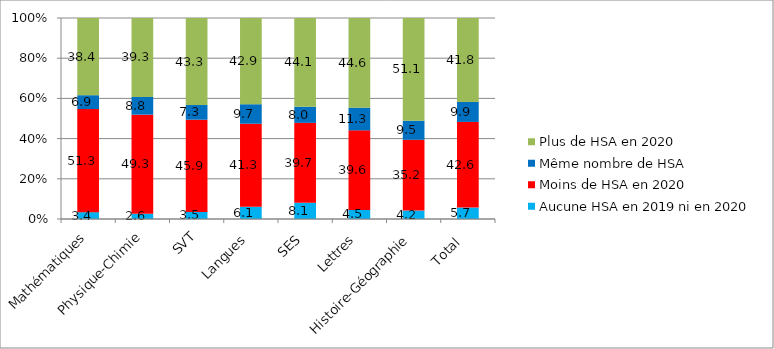
| Category | Aucune HSA en 2019 ni en 2020 | Moins de HSA en 2020 | Même nombre de HSA | Plus de HSA en 2020 |
|---|---|---|---|---|
| Mathématiques | 3.4 | 51.3 | 6.9 | 38.4 |
| Physique-Chimie | 2.6 | 49.3 | 8.8 | 39.3 |
| SVT | 3.5 | 45.9 | 7.3 | 43.3 |
| Langues | 6.1 | 41.3 | 9.7 | 42.9 |
| SES | 8.1 | 39.7 | 8 | 44.1 |
| Lettres | 4.5 | 39.6 | 11.3 | 44.6 |
| Histoire-Géographie | 4.2 | 35.2 | 9.5 | 51.1 |
| Total | 5.7 | 42.6 | 9.9 | 41.8 |